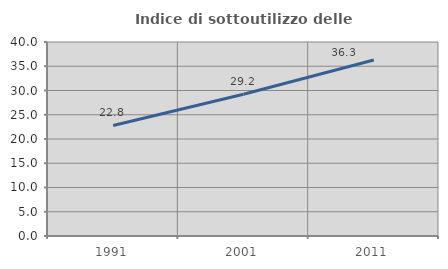
| Category | Indice di sottoutilizzo delle abitazioni  |
|---|---|
| 1991.0 | 22.785 |
| 2001.0 | 29.217 |
| 2011.0 | 36.29 |